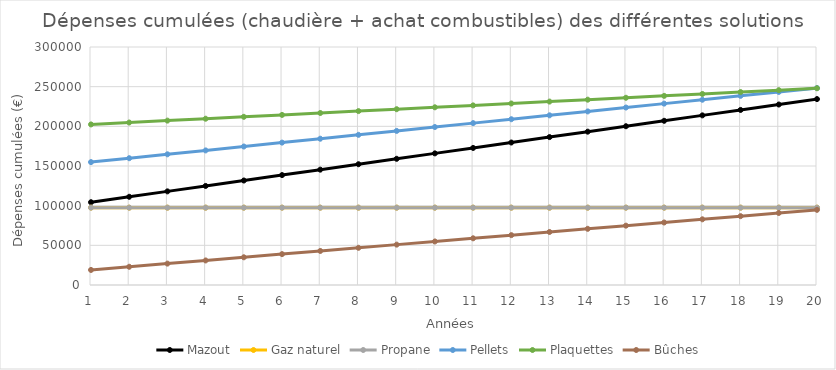
| Category | Mazout | Gaz naturel | Propane | Pellets | Plaquettes | Bûches |
|---|---|---|---|---|---|---|
| 1.0 | 104342 | 97500 | 97500 | 154913.6 | 202400 | 18987.5 |
| 2.0 | 111184 | 97500 | 97500 | 159827.2 | 204800 | 22975 |
| 3.0 | 118026 | 97500 | 97500 | 164740.8 | 207200 | 26962.5 |
| 4.0 | 124868 | 97500 | 97500 | 169654.4 | 209600 | 30950 |
| 5.0 | 131710 | 97500 | 97500 | 174568 | 212000 | 34937.5 |
| 6.0 | 138552 | 97500 | 97500 | 179481.6 | 214400 | 38925 |
| 7.0 | 145394 | 97500 | 97500 | 184395.2 | 216800 | 42912.5 |
| 8.0 | 152236 | 97500 | 97500 | 189308.8 | 219200 | 46900 |
| 9.0 | 159078 | 97500 | 97500 | 194222.4 | 221600 | 50887.5 |
| 10.0 | 165920 | 97500 | 97500 | 199136 | 224000 | 54875 |
| 11.0 | 172762 | 97500 | 97500 | 204049.6 | 226400 | 58862.5 |
| 12.0 | 179604 | 97500 | 97500 | 208963.2 | 228800 | 62850 |
| 13.0 | 186446 | 97500 | 97500 | 213876.8 | 231200 | 66837.5 |
| 14.0 | 193288 | 97500 | 97500 | 218790.4 | 233600 | 70825 |
| 15.0 | 200130 | 97500 | 97500 | 223704 | 236000 | 74812.5 |
| 16.0 | 206972 | 97500 | 97500 | 228617.6 | 238400 | 78800 |
| 17.0 | 213814 | 97500 | 97500 | 233531.2 | 240800 | 82787.5 |
| 18.0 | 220656 | 97500 | 97500 | 238444.8 | 243200 | 86775 |
| 19.0 | 227498 | 97500 | 97500 | 243358.4 | 245600 | 90762.5 |
| 20.0 | 234340 | 97500 | 97500 | 248272 | 248000 | 94750 |